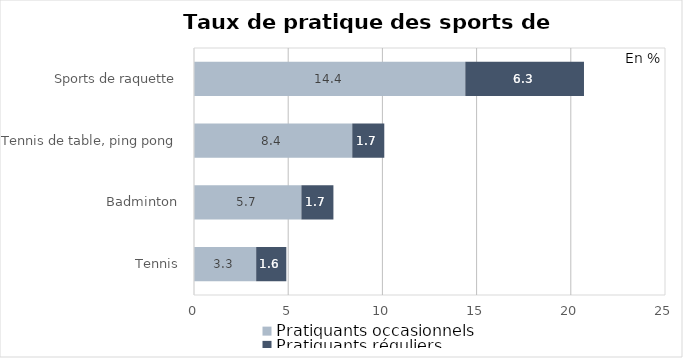
| Category | Pratiquants occasionnels | Pratiquants réguliers |
|---|---|---|
| Tennis | 3.3 | 1.6 |
| Badminton | 5.7 | 1.7 |
| Tennis de table, ping pong | 8.4 | 1.7 |
| Sports de raquette | 14.4 | 6.3 |